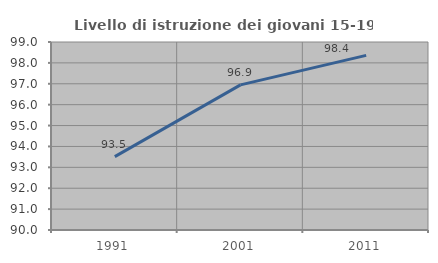
| Category | Livello di istruzione dei giovani 15-19 anni |
|---|---|
| 1991.0 | 93.511 |
| 2001.0 | 96.947 |
| 2011.0 | 98.359 |